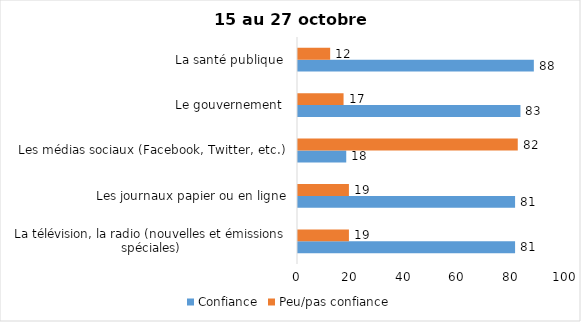
| Category | Confiance | Peu/pas confiance |
|---|---|---|
| La télévision, la radio (nouvelles et émissions spéciales) | 81 | 19 |
| Les journaux papier ou en ligne | 81 | 19 |
| Les médias sociaux (Facebook, Twitter, etc.) | 18 | 82 |
| Le gouvernement  | 83 | 17 |
| La santé publique  | 88 | 12 |